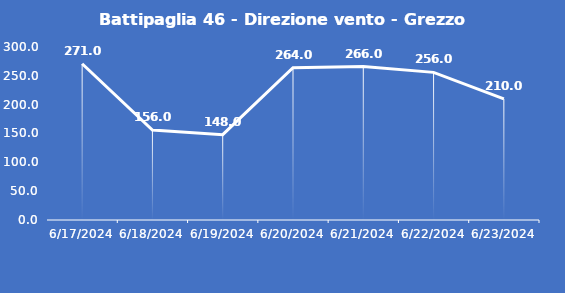
| Category | Battipaglia 46 - Direzione vento - Grezzo (°N) |
|---|---|
| 6/17/24 | 271 |
| 6/18/24 | 156 |
| 6/19/24 | 148 |
| 6/20/24 | 264 |
| 6/21/24 | 266 |
| 6/22/24 | 256 |
| 6/23/24 | 210 |